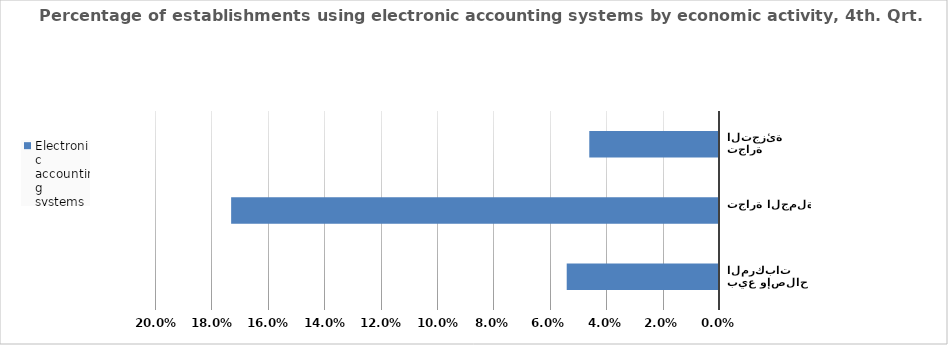
| Category | Electronic accounting systems |
|---|---|
| بيع وإصلاح المركبات  | 0.054 |
| تجارة الجملة | 0.173 |
| تجارة التجزئة | 0.046 |